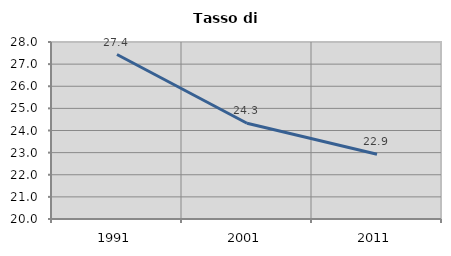
| Category | Tasso di disoccupazione   |
|---|---|
| 1991.0 | 27.434 |
| 2001.0 | 24.329 |
| 2011.0 | 22.928 |